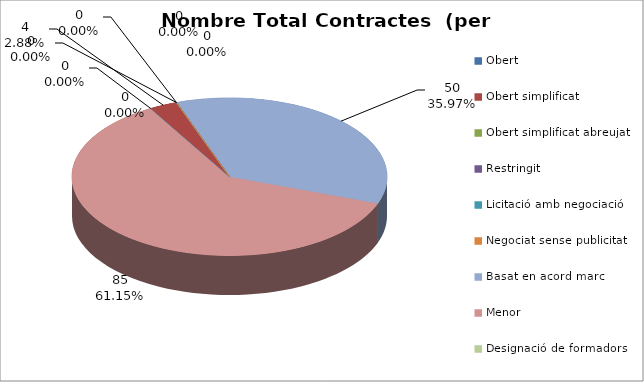
| Category | Nombre Total Contractes |
|---|---|
| Obert | 0 |
| Obert simplificat | 4 |
| Obert simplificat abreujat | 0 |
| Restringit | 0 |
| Licitació amb negociació | 0 |
| Negociat sense publicitat | 0 |
| Basat en acord marc | 50 |
| Menor | 85 |
| Designació de formadors | 0 |